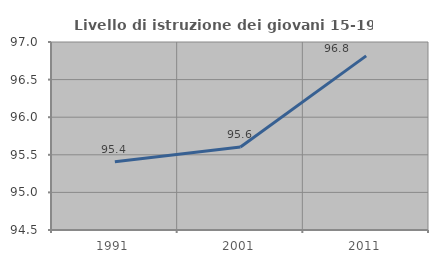
| Category | Livello di istruzione dei giovani 15-19 anni |
|---|---|
| 1991.0 | 95.407 |
| 2001.0 | 95.604 |
| 2011.0 | 96.815 |